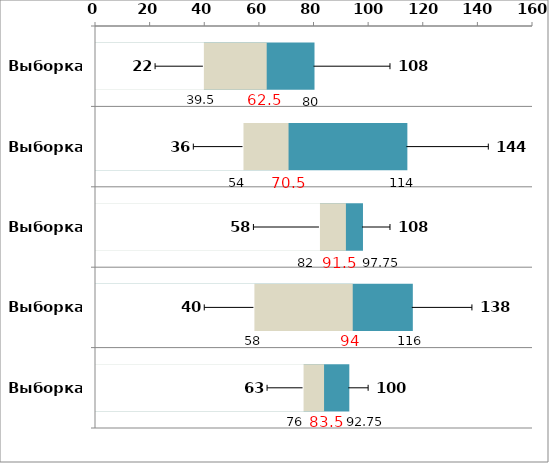
| Category | МАКС | Q3 | Q2 (Медиана) | Q1 | МИН |
|---|---|---|---|---|---|
| Выборка1 | 108 | 80 | 62.5 | 39.5 | 22 |
| Выборка2 | 144 | 114 | 70.5 | 54 | 36 |
| Выборка3 | 108 | 97.75 | 91.5 | 82 | 58 |
| Выборка4 | 138 | 116 | 94 | 58 | 40 |
| Выборка5 | 100 | 92.75 | 83.5 | 76 | 63 |